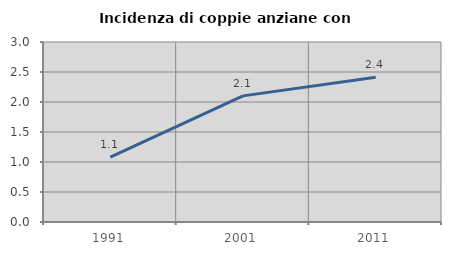
| Category | Incidenza di coppie anziane con figli |
|---|---|
| 1991.0 | 1.083 |
| 2001.0 | 2.102 |
| 2011.0 | 2.414 |